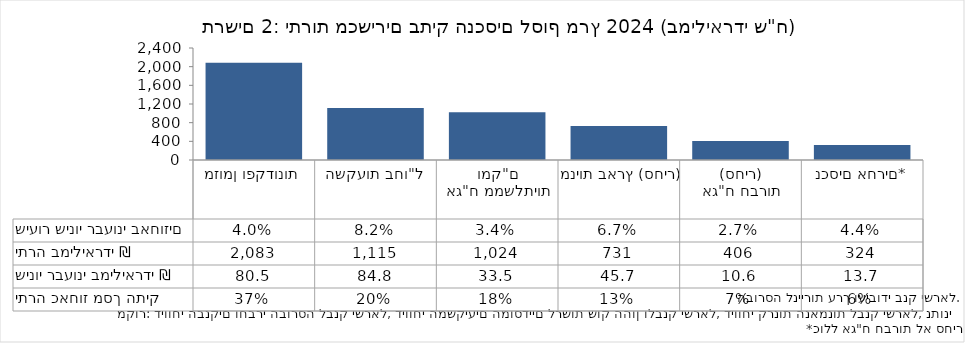
| Category | יתרה במיליארדי ₪   |
|---|---|
| מזומן ופקדונות | 2082.79 |
| השקעות בחו"ל | 1114.6 |
| אג"ח ממשלתיות ומק"ם | 1023.58 |
| מניות בארץ (סחיר) | 731 |
| אג"ח חברות
(סחיר) | 405.79 |
| נכסים אחרים* | 323.68 |